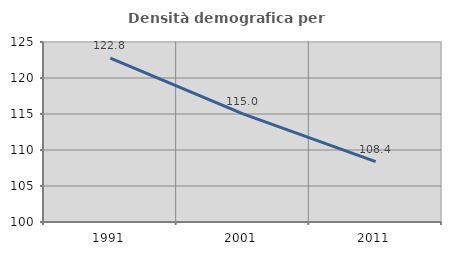
| Category | Densità demografica |
|---|---|
| 1991.0 | 122.753 |
| 2001.0 | 115.008 |
| 2011.0 | 108.384 |